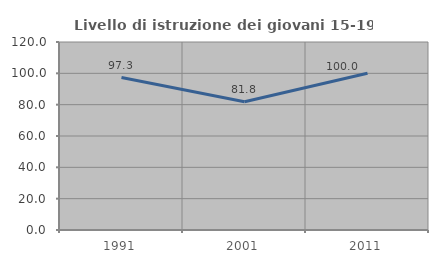
| Category | Livello di istruzione dei giovani 15-19 anni |
|---|---|
| 1991.0 | 97.297 |
| 2001.0 | 81.818 |
| 2011.0 | 100 |